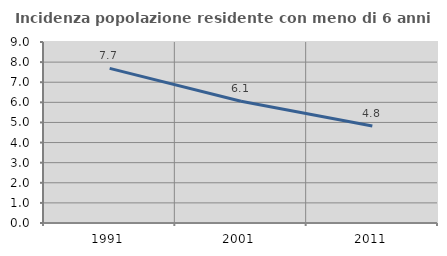
| Category | Incidenza popolazione residente con meno di 6 anni |
|---|---|
| 1991.0 | 7.688 |
| 2001.0 | 6.05 |
| 2011.0 | 4.825 |